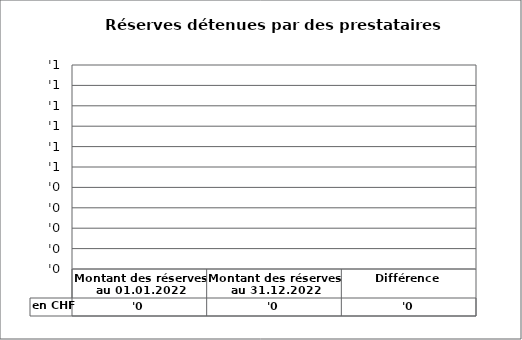
| Category | en CHF |
|---|---|
| Montant des réserves au 01.01.2022 | 0 |
| Montant des réserves au 31.12.2022 | 0 |
| Différence | 0 |